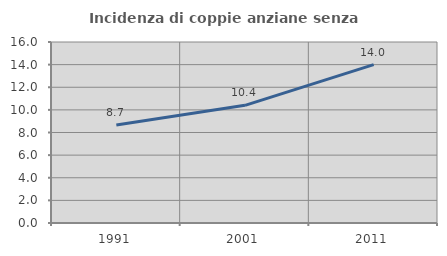
| Category | Incidenza di coppie anziane senza figli  |
|---|---|
| 1991.0 | 8.666 |
| 2001.0 | 10.401 |
| 2011.0 | 13.998 |